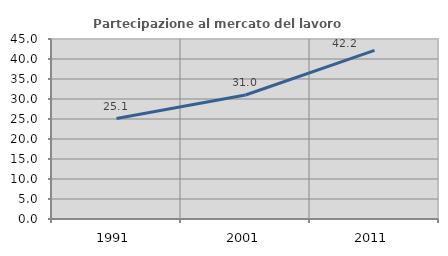
| Category | Partecipazione al mercato del lavoro  femminile |
|---|---|
| 1991.0 | 25.11 |
| 2001.0 | 31.01 |
| 2011.0 | 42.173 |